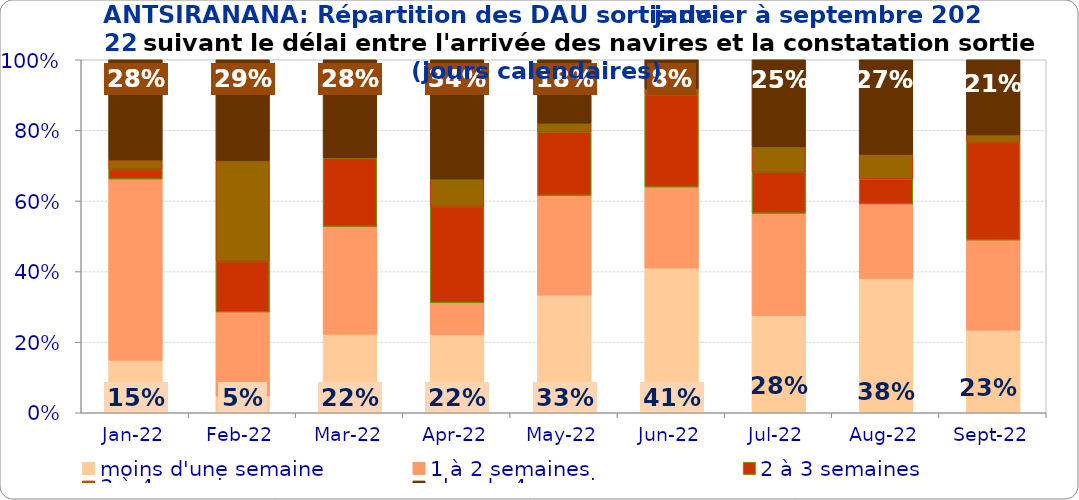
| Category | moins d'une semaine | 1 à 2 semaines | 2 à 3 semaines | 3 à 4 semaines | plus de 4 semaines |
|---|---|---|---|---|---|
| 2022-01-01 | 0.149 | 0.514 | 0.027 | 0.027 | 0.284 |
| 2022-02-01 | 0.048 | 0.238 | 0.143 | 0.286 | 0.286 |
| 2022-03-01 | 0.222 | 0.306 | 0.194 | 0 | 0.278 |
| 2022-04-01 | 0.221 | 0.091 | 0.273 | 0.078 | 0.338 |
| 2022-05-01 | 0.333 | 0.282 | 0.179 | 0.026 | 0.179 |
| 2022-06-01 | 0.41 | 0.23 | 0.262 | 0.016 | 0.082 |
| 2022-07-01 | 0.275 | 0.29 | 0.116 | 0.072 | 0.246 |
| 2022-08-01 | 0.38 | 0.211 | 0.07 | 0.07 | 0.268 |
| 2022-09-01 | 0.234 | 0.255 | 0.277 | 0.021 | 0.213 |